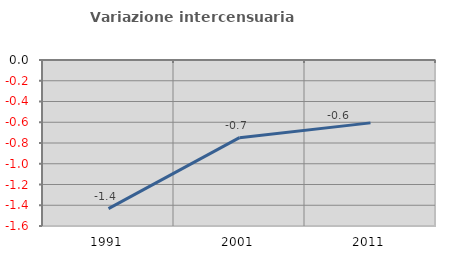
| Category | Variazione intercensuaria annua |
|---|---|
| 1991.0 | -1.433 |
| 2001.0 | -0.749 |
| 2011.0 | -0.606 |